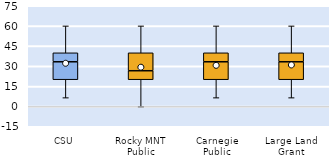
| Category | 25th | 50th | 75th |
|---|---|---|---|
| CSU | 20 | 13.333 | 6.667 |
| Rocky MNT Public | 20 | 6.667 | 13.333 |
| Carnegie Public | 20 | 13.333 | 6.667 |
| Large Land Grant | 20 | 13.333 | 6.667 |